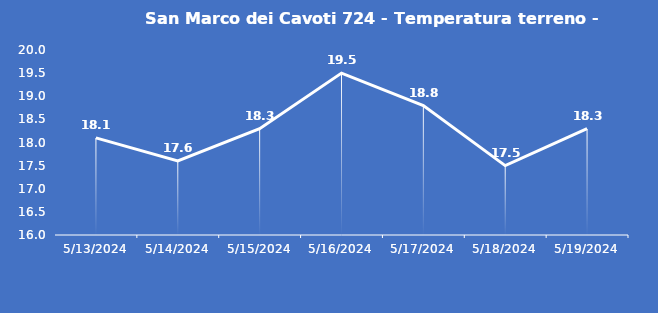
| Category | San Marco dei Cavoti 724 - Temperatura terreno - Grezzo (°C) |
|---|---|
| 5/13/24 | 18.1 |
| 5/14/24 | 17.6 |
| 5/15/24 | 18.3 |
| 5/16/24 | 19.5 |
| 5/17/24 | 18.8 |
| 5/18/24 | 17.5 |
| 5/19/24 | 18.3 |